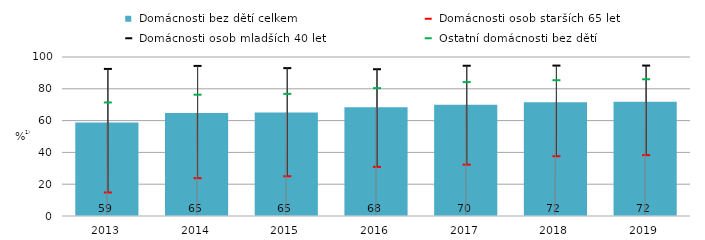
| Category |  Domácnosti bez dětí celkem |
|---|---|
| 2013.0 | 58.76 |
| 2014.0 | 64.715 |
| 2015.0 | 65.065 |
| 2016.0 | 68.396 |
| 2017.0 | 69.9 |
| 2018.0 | 71.6 |
| 2019.0 | 71.9 |